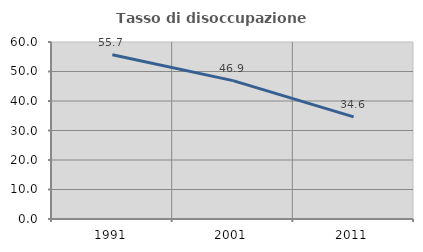
| Category | Tasso di disoccupazione giovanile  |
|---|---|
| 1991.0 | 55.659 |
| 2001.0 | 46.918 |
| 2011.0 | 34.62 |